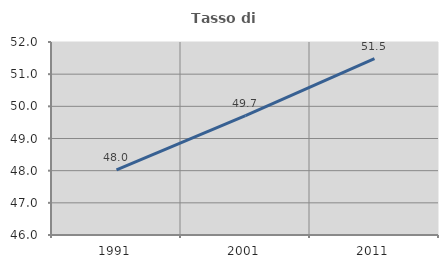
| Category | Tasso di occupazione   |
|---|---|
| 1991.0 | 48.028 |
| 2001.0 | 49.71 |
| 2011.0 | 51.484 |